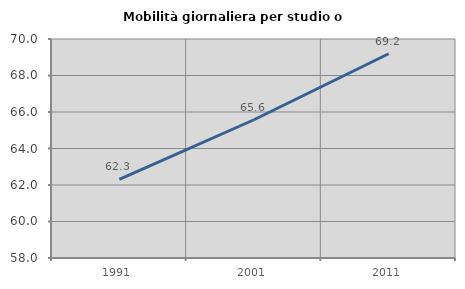
| Category | Mobilità giornaliera per studio o lavoro |
|---|---|
| 1991.0 | 62.314 |
| 2001.0 | 65.575 |
| 2011.0 | 69.193 |